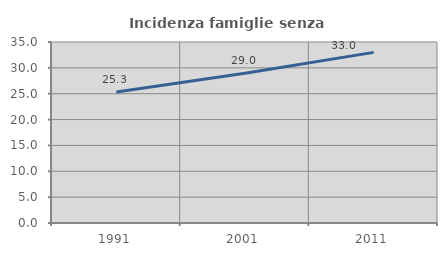
| Category | Incidenza famiglie senza nuclei |
|---|---|
| 1991.0 | 25.325 |
| 2001.0 | 28.962 |
| 2011.0 | 32.995 |